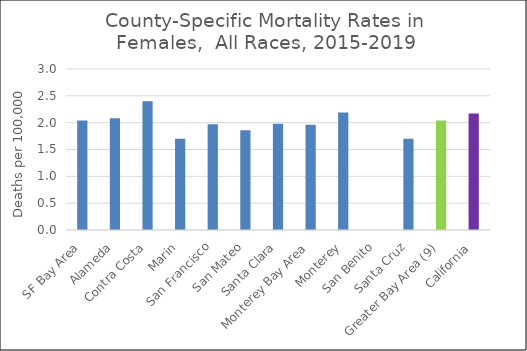
| Category | Female |
|---|---|
| SF Bay Area | 2.04 |
|   Alameda | 2.08 |
|   Contra Costa | 2.4 |
|   Marin | 1.7 |
|   San Francisco | 1.97 |
|   San Mateo | 1.86 |
|   Santa Clara | 1.98 |
| Monterey Bay Area | 1.96 |
|   Monterey | 2.19 |
|   San Benito | 0 |
|   Santa Cruz | 1.7 |
| Greater Bay Area (9) | 2.04 |
| California | 2.17 |